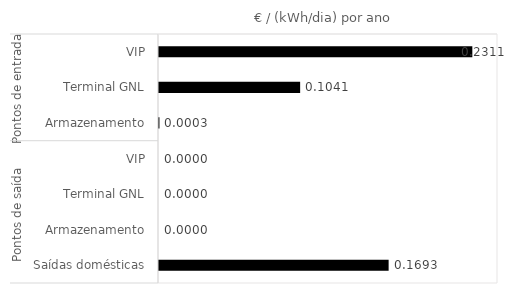
| Category | €/(kWh/day) per year |
|---|---|
| 0 | 0.231 |
| 1 | 0.104 |
| 2 | 0 |
| 3 | 0 |
| 4 | 0 |
| 5 | 0 |
| 6 | 0.169 |